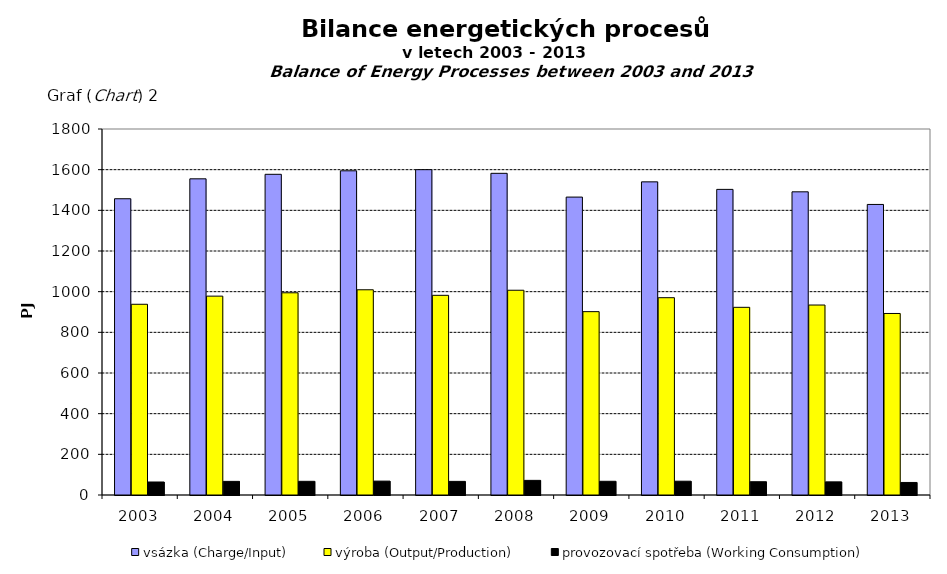
| Category | vsázka (Charge/Input) | výroba (Output/Production) | provozovací spotřeba (Working Consumption) |
|---|---|---|---|
| 2003.0 | 1457 | 938 | 64 |
| 2004.0 | 1555 | 978 | 67 |
| 2005.0 | 1577.209 | 994.448 | 67.261 |
| 2006.0 | 1594.403 | 1009.322 | 68.3 |
| 2007.0 | 1600 | 982 | 67 |
| 2008.0 | 1582 | 1007 | 72 |
| 2009.0 | 1465.135 | 901.747 | 67.43 |
| 2010.0 | 1540.058 | 970.341 | 67.788 |
| 2011.0 | 1503 | 923 | 65.3 |
| 2012.0 | 1491.072 | 934.349 | 64.637 |
| 2013.0 | 1428.996 | 892.757 | 61.649 |